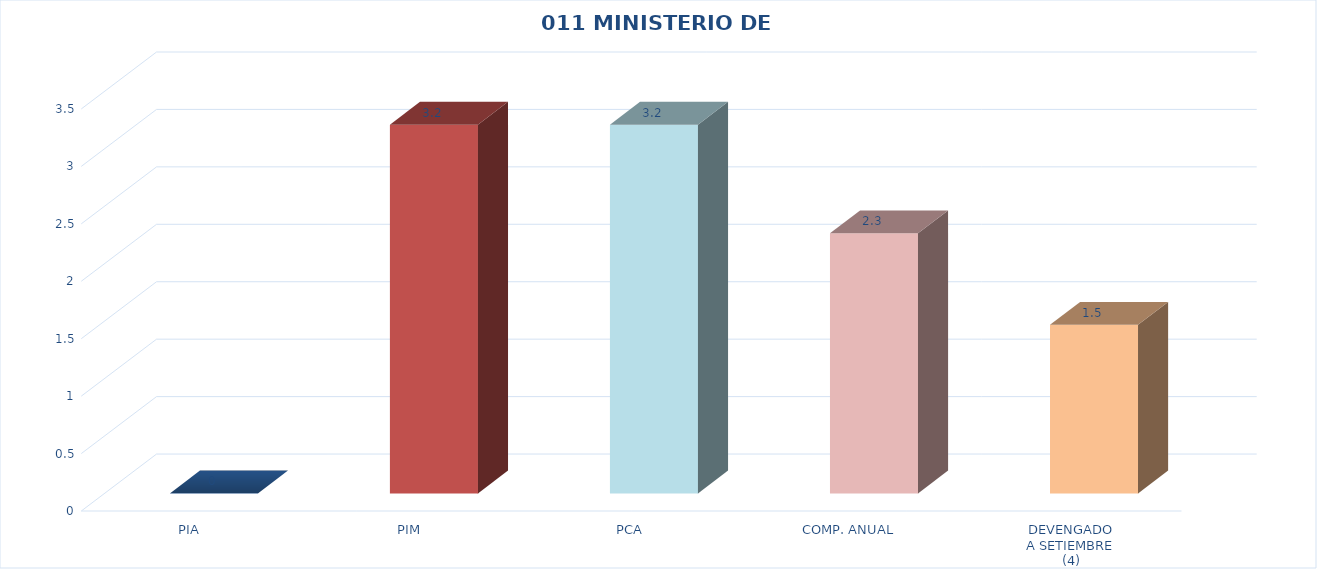
| Category | 011 MINISTERIO DE SALUD |
|---|---|
| PIA | 0 |
| PIM | 3.21 |
| PCA | 3.21 |
| COMP. ANUAL | 2.264 |
| DEVENGADO
A SETIEMBRE
(4) | 1.467 |